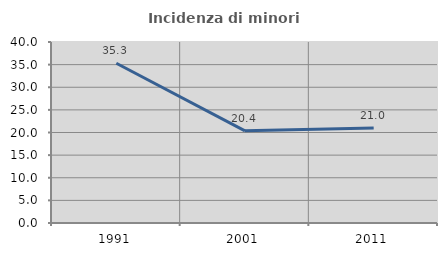
| Category | Incidenza di minori stranieri |
|---|---|
| 1991.0 | 35.294 |
| 2001.0 | 20.37 |
| 2011.0 | 20.994 |